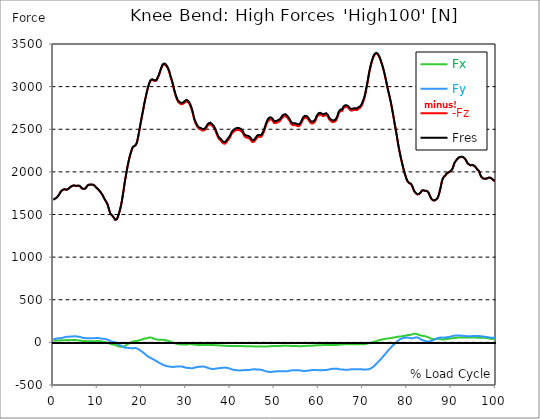
| Category |  Fx |  Fy |  -Fz |  Fres |
|---|---|---|---|---|
| 0.0 | 21.043 | 37.534 | 1674.356 | 1675.414 |
| 0.167348456675344 | 20.883 | 38.448 | 1678.892 | 1679.949 |
| 0.334696913350688 | 20.722 | 39.361 | 1683.411 | 1684.469 |
| 0.5020453700260321 | 20.995 | 41.493 | 1687.754 | 1688.828 |
| 0.669393826701376 | 21.46 | 43.768 | 1693.54 | 1694.63 |
| 0.83674228337672 | 22.02 | 45.387 | 1703.412 | 1704.502 |
| 1.0040907400520642 | 22.694 | 47.182 | 1712.596 | 1713.701 |
| 1.1621420602454444 | 22.886 | 47.871 | 1722.147 | 1723.237 |
| 1.3294905169207885 | 22.053 | 46.99 | 1736.283 | 1737.34 |
| 1.4968389735961325 | 22.613 | 47.423 | 1753.191 | 1754.248 |
| 1.6641874302714765 | 23.719 | 49.009 | 1767.262 | 1768.336 |
| 1.8315358869468206 | 23.896 | 50.884 | 1777.759 | 1778.849 |
| 1.9988843436221646 | 24.232 | 53.224 | 1784.987 | 1786.109 |
| 2.1662328002975086 | 24.473 | 55.452 | 1790.1 | 1791.286 |
| 2.333581256972853 | 24.905 | 57.679 | 1793.53 | 1794.764 |
| 2.5009297136481967 | 25.723 | 59.987 | 1794.94 | 1796.254 |
| 2.6682781703235405 | 26.155 | 62.103 | 1794.315 | 1795.709 |
| 2.8356266269988843 | 26.572 | 63.834 | 1789.843 | 1791.286 |
| 3.002975083674229 | 27.325 | 65.805 | 1789.651 | 1791.142 |
| 3.1703235403495724 | 28.078 | 67.504 | 1792.632 | 1794.171 |
| 3.337671997024917 | 27.742 | 67.36 | 1797.152 | 1798.69 |
| 3.4957233172182973 | 26.588 | 66.654 | 1802.857 | 1804.347 |
| 3.663071773893641 | 25.835 | 67.055 | 1813.354 | 1814.861 |
| 3.8304202305689854 | 25.578 | 67.456 | 1822.073 | 1823.595 |
| 3.997768687244329 | 26.091 | 68.225 | 1827.201 | 1828.74 |
| 4.165117143919673 | 26.973 | 68.962 | 1831.993 | 1833.564 |
| 4.332465600595017 | 27.502 | 69.699 | 1835.679 | 1837.282 |
| 4.499814057270361 | 27.678 | 70.517 | 1838.5 | 1840.135 |
| 4.667162513945706 | 27.694 | 71.126 | 1840.487 | 1842.154 |
| 4.834510970621049 | 27.213 | 71.046 | 1839.013 | 1840.68 |
| 5.001859427296393 | 27.021 | 71.318 | 1834.974 | 1836.657 |
| 5.169207883971737 | 26.796 | 70.421 | 1833.532 | 1835.199 |
| 5.336556340647081 | 25.466 | 68.321 | 1834.718 | 1836.288 |
| 5.503904797322425 | 24.232 | 67.76 | 1837.09 | 1838.612 |
| 5.671253253997769 | 23.206 | 67.103 | 1838.356 | 1839.862 |
| 5.82930457419115 | 22.678 | 66.35 | 1836.705 | 1838.179 |
| 5.996653030866494 | 22.325 | 64.875 | 1832.057 | 1833.5 |
| 6.164001487541838 | 21.444 | 62.696 | 1825.07 | 1826.464 |
| 6.331349944217181 | 18.671 | 58.016 | 1811.832 | 1813.226 |
| 6.498698400892526 | 16.86 | 54.731 | 1802.344 | 1803.754 |
| 6.66604685756787 | 16.427 | 53.24 | 1800.181 | 1801.607 |
| 6.833395314243213 | 16.123 | 51.189 | 1798.85 | 1800.213 |
| 7.000743770918558 | 15.754 | 50.419 | 1799.507 | 1800.886 |
| 7.168092227593902 | 15.385 | 50.195 | 1802.585 | 1803.995 |
| 7.335440684269246 | 14.905 | 49.81 | 1809.428 | 1810.902 |
| 7.50278914094459 | 14.167 | 48.48 | 1820.166 | 1821.688 |
| 7.6701375976199335 | 13.462 | 48.112 | 1836.288 | 1837.843 |
| 7.837486054295278 | 13.046 | 48.625 | 1843.084 | 1844.654 |
| 7.995537374488658 | 12.998 | 48.336 | 1848.388 | 1849.927 |
| 8.162885831164003 | 12.965 | 48.368 | 1850.953 | 1852.491 |
| 8.330234287839346 | 13.51 | 48.288 | 1849.366 | 1850.905 |
| 8.49758274451469 | 13.863 | 47.951 | 1848.468 | 1849.991 |
| 8.664931201190035 | 13.719 | 47.503 | 1850.231 | 1851.754 |
| 8.832279657865378 | 13.558 | 47.535 | 1850.568 | 1852.074 |
| 8.999628114540721 | 13.558 | 48.256 | 1848.02 | 1849.558 |
| 9.166976571216066 | 13.703 | 48.929 | 1843.805 | 1845.359 |
| 9.334325027891412 | 13.735 | 49.73 | 1836.657 | 1838.26 |
| 9.501673484566755 | 13.911 | 50.612 | 1827.313 | 1828.948 |
| 9.669021941242098 | 14.584 | 50.948 | 1816.992 | 1818.659 |
| 9.836370397917442 | 15.065 | 50.964 | 1807.873 | 1809.54 |
| 10.003718854592787 | 14.985 | 51.125 | 1800.822 | 1802.488 |
| 10.17106731126813 | 14.937 | 50.788 | 1792.808 | 1794.459 |
| 10.329118631461512 | 14.472 | 49.618 | 1782.583 | 1784.218 |
| 10.496467088136853 | 13.254 | 46.862 | 1772.182 | 1773.737 |
| 10.663815544812199 | 12.276 | 45.612 | 1762.005 | 1763.48 |
| 10.831164001487544 | 10.417 | 44.281 | 1750.53 | 1751.989 |
| 10.998512458162887 | 8.975 | 43.512 | 1737.18 | 1738.607 |
| 11.16586091483823 | 8.366 | 44.153 | 1722.388 | 1723.83 |
| 11.333209371513574 | 6.763 | 43.208 | 1704.887 | 1706.265 |
| 11.50055782818892 | 4.215 | 41.332 | 1687.242 | 1688.556 |
| 11.667906284864264 | 3.798 | 41.252 | 1672.689 | 1673.956 |
| 11.835254741539607 | 1.186 | 37.534 | 1657.641 | 1658.762 |
| 12.00260319821495 | -1.282 | 33.688 | 1644.371 | 1645.364 |
| 12.169951654890292 | -2.821 | 32.309 | 1627.911 | 1628.857 |
| 12.337300111565641 | -4.519 | 31.3 | 1604.128 | 1605.057 |
| 12.504648568240984 | -7.164 | 27.678 | 1574.174 | 1575.024 |
| 12.662699888434362 | -11.187 | 22.597 | 1544.926 | 1545.679 |
| 12.830048345109708 | -15.225 | 17.453 | 1516.495 | 1517.184 |
| 12.997396801785053 | -19.2 | 11.796 | 1503.033 | 1503.738 |
| 13.164745258460396 | -22.101 | 7.597 | 1495.516 | 1496.285 |
| 13.33209371513574 | -23.96 | 6.587 | 1486.317 | 1487.086 |
| 13.499442171811083 | -25.675 | 5.737 | 1476.941 | 1477.695 |
| 13.666790628486426 | -26.364 | 6.074 | 1462.838 | 1463.559 |
| 13.834139085161771 | -28.095 | 3.975 | 1449.76 | 1450.482 |
| 14.001487541837117 | -30.37 | 0.641 | 1437.212 | 1437.949 |
| 14.16883599851246 | -33.159 | -3.558 | 1433.75 | 1434.535 |
| 14.336184455187803 | -37.646 | -10.065 | 1443.222 | 1444.103 |
| 14.503532911863147 | -42.583 | -17.677 | 1460.402 | 1461.444 |
| 14.670881368538492 | -45.916 | -23.671 | 1484.81 | 1485.996 |
| 14.828932688731873 | -48.641 | -29.377 | 1513.145 | 1514.459 |
| 14.996281145407215 | -50.035 | -32.598 | 1541.288 | 1542.698 |
| 15.163629602082558 | -50.211 | -36.557 | 1575.264 | 1576.723 |
| 15.330978058757903 | -50.035 | -40.868 | 1615.01 | 1616.549 |
| 15.498326515433247 | -49.65 | -44.858 | 1661.102 | 1662.705 |
| 15.665674972108594 | -48.544 | -48.608 | 1712.019 | 1713.685 |
| 15.833023428783937 | -48.881 | -54.074 | 1769.281 | 1771.092 |
| 16.00037188545928 | -47.374 | -59.907 | 1827.265 | 1829.157 |
| 16.167720342134626 | -42.534 | -62.151 | 1886.772 | 1888.599 |
| 16.335068798809967 | -37.534 | -63.465 | 1935.172 | 1936.903 |
| 16.502417255485312 | -30.995 | -62.712 | 1984.117 | 1985.736 |
| 16.669765712160658 | -25.354 | -62.712 | 2033.447 | 2035.001 |
| 16.837114168836 | -19.168 | -63.914 | 2079.01 | 2080.549 |
| 17.004462625511344 | -14.504 | -65.212 | 2118.9 | 2120.439 |
| 17.16251394570472 | -9.904 | -66.654 | 2158.454 | 2160.04 |
| 17.32986240238007 | -4.92 | -67.36 | 2192.847 | 2194.433 |
| 17.497210859055414 | -1.33 | -67.6 | 2221.39 | 2222.977 |
| 17.664559315730756 | 2.244 | -67.824 | 2249.324 | 2250.911 |
| 17.8319077724061 | 5.898 | -67.888 | 2274.294 | 2275.848 |
| 17.999256229081443 | 9.552 | -68.177 | 2293.333 | 2294.904 |
| 18.166604685756788 | 12.549 | -68.289 | 2304.279 | 2305.85 |
| 18.333953142432133 | 13.847 | -67.087 | 2302.34 | 2303.895 |
| 18.501301599107478 | 14.937 | -66.27 | 2302.901 | 2304.423 |
| 18.668650055782823 | 15.754 | -67.392 | 2316.379 | 2317.95 |
| 18.835998512458165 | 16.395 | -69.844 | 2337.037 | 2338.704 |
| 19.00334696913351 | 18.238 | -73.434 | 2368.658 | 2370.437 |
| 19.170695425808855 | 20.53 | -78.354 | 2408.452 | 2410.391 |
| 19.338043882484197 | 22.822 | -83.723 | 2454.624 | 2456.724 |
| 19.496095202677576 | 25.098 | -89.156 | 2503.008 | 2505.252 |
| 19.66344365935292 | 27.341 | -94.925 | 2551.12 | 2553.54 |
| 19.830792116028263 | 29.938 | -101.416 | 2598.767 | 2601.443 |
| 19.998140572703612 | 33.079 | -107.394 | 2645.26 | 2648.209 |
| 20.165489029378953 | 36.092 | -113.58 | 2689.044 | 2692.266 |
| 20.3328374860543 | 39.65 | -120.119 | 2733.598 | 2737.108 |
| 20.500185942729644 | 42.55 | -127.523 | 2781.004 | 2784.851 |
| 20.667534399404985 | 44.81 | -134.495 | 2824.693 | 2828.844 |
| 20.83488285608033 | 45.708 | -142.588 | 2863.413 | 2867.997 |
| 21.002231312755672 | 46.509 | -150.233 | 2900.755 | 2905.707 |
| 21.16957976943102 | 48.865 | -157.365 | 2939.924 | 2945.244 |
| 21.336928226106362 | 51.894 | -163.246 | 2974.942 | 2980.599 |
| 21.504276682781704 | 53.961 | -168.856 | 3005.568 | 3011.498 |
| 21.67162513945705 | 55.612 | -173.888 | 3032.861 | 3039.048 |
| 21.82967645965043 | 56.702 | -178.231 | 3054.465 | 3060.892 |
| 21.997024916325774 | 57.07 | -182.43 | 3070.604 | 3077.239 |
| 22.16437337300112 | 56.285 | -187.238 | 3079.306 | 3086.182 |
| 22.33172182967646 | 53.609 | -192.495 | 3079.675 | 3086.791 |
| 22.499070286351806 | 49.746 | -198.104 | 3078.441 | 3085.781 |
| 22.666418743027148 | 45.211 | -202.191 | 3069.835 | 3077.399 |
| 22.833767199702496 | 41.348 | -205.925 | 3064.626 | 3072.415 |
| 23.00111565637784 | 38.335 | -209.884 | 3065.251 | 3073.264 |
| 23.168464113053183 | 35.659 | -214.627 | 3065.86 | 3074.178 |
| 23.335812569728528 | 33.896 | -220.733 | 3072.367 | 3081.101 |
| 23.50316102640387 | 33.031 | -225.413 | 3091.198 | 3100.205 |
| 23.670509483079215 | 32.101 | -231.648 | 3108.955 | 3118.363 |
| 23.83785793975456 | 30.563 | -237.754 | 3126.841 | 3136.649 |
| 23.995909259947936 | 30.771 | -242.93 | 3152.275 | 3162.404 |
| 24.163257716623285 | 31.508 | -246.825 | 3178.975 | 3189.329 |
| 24.330606173298627 | 31.316 | -250.655 | 3205.403 | 3215.981 |
| 24.49795462997397 | 31.684 | -254.63 | 3227.103 | 3237.953 |
| 24.665303086649313 | 31.797 | -258.78 | 3246.447 | 3257.586 |
| 24.83265154332466 | 30.771 | -263.396 | 3256.768 | 3268.259 |
| 25.0 | 29.313 | -267.451 | 3259.861 | 3271.625 |
| 25.167348456675345 | 27.79 | -270.736 | 3260.23 | 3272.25 |
| 25.334696913350694 | 26.059 | -273.589 | 3254.541 | 3266.785 |
| 25.502045370026035 | 24.104 | -276.394 | 3244.828 | 3257.329 |
| 25.669393826701377 | 21.94 | -279.054 | 3231.046 | 3243.755 |
| 25.836742283376722 | 20.161 | -280.705 | 3214.763 | 3227.664 |
| 26.004090740052067 | 17.838 | -282.404 | 3196.46 | 3209.57 |
| 26.17143919672741 | 15.161 | -284.118 | 3172.661 | 3185.979 |
| 26.329490516920792 | 12.677 | -284.295 | 3143.957 | 3157.372 |
| 26.49683897359613 | 8.606 | -283.926 | 3109.068 | 3122.482 |
| 26.66418743027148 | 3.862 | -286.346 | 3085.525 | 3099.195 |
| 26.831535886946828 | -0.16 | -288.846 | 3056.837 | 3070.828 |
| 26.998884343622166 | -3.013 | -289.952 | 3023.085 | 3037.301 |
| 27.166232800297514 | -5.112 | -288.029 | 2987.699 | 3001.962 |
| 27.333581256972852 | -7.853 | -286.394 | 2948.61 | 2962.97 |
| 27.5009297136482 | -10.001 | -285.513 | 2918.432 | 2932.888 |
| 27.668278170323543 | -12.645 | -285.224 | 2889.087 | 2903.688 |
| 27.835626626998888 | -15.241 | -283.958 | 2863.525 | 2878.157 |
| 28.002975083674233 | -17.469 | -283.045 | 2841.873 | 2856.538 |
| 28.170323540349575 | -19.408 | -282.452 | 2825.045 | 2839.774 |
| 28.33767199702492 | -21.331 | -282.099 | 2815.189 | 2829.966 |
| 28.50502045370026 | -22.405 | -281.154 | 2806.294 | 2821.055 |
| 28.663071773893645 | -22.998 | -281.458 | 2799.563 | 2814.436 |
| 28.830420230568986 | -23.559 | -282.163 | 2794.707 | 2809.708 |
| 28.99776868724433 | -23.799 | -282.612 | 2791.213 | 2806.294 |
| 29.165117143919673 | -23.479 | -284.118 | 2794.435 | 2809.692 |
| 29.33246560059502 | -23.847 | -287.628 | 2802.16 | 2817.769 |
| 29.499814057270367 | -23.735 | -289.872 | 2804.596 | 2820.414 |
| 29.66716251394571 | -24.12 | -292.1 | 2813.042 | 2829.036 |
| 29.834510970621054 | -24.12 | -294.391 | 2820.093 | 2836.28 |
| 30.00185942729639 | -23.992 | -296.731 | 2826.392 | 2842.787 |
| 30.169207883971744 | -23.639 | -298.59 | 2827.898 | 2844.47 |
| 30.33655634064708 | -23.335 | -300.097 | 2823.106 | 2839.886 |
| 30.50390479732243 | -21.988 | -300.626 | 2813.586 | 2830.51 |
| 30.671253253997772 | -20.514 | -300.706 | 2803.618 | 2820.638 |
| 30.829304574191156 | -19.584 | -301.571 | 2790.075 | 2807.288 |
| 30.996653030866494 | -19.873 | -302.389 | 2771.004 | 2788.441 |
| 31.164001487541842 | -20.963 | -303.046 | 2746.692 | 2764.337 |
| 31.331349944217187 | -22.02 | -302.517 | 2719.879 | 2737.605 |
| 31.498698400892525 | -23.399 | -302.228 | 2688.628 | 2706.481 |
| 31.666046857567874 | -25.146 | -301.187 | 2650.597 | 2668.546 |
| 31.833395314243212 | -26.748 | -297.709 | 2613.703 | 2631.509 |
| 32.00074377091856 | -27.486 | -295.786 | 2589.087 | 2606.812 |
| 32.1680922275939 | -27.726 | -292.709 | 2567.595 | 2585.096 |
| 32.33544068426925 | -28.447 | -289.952 | 2550.19 | 2567.467 |
| 32.50278914094459 | -29.152 | -288.702 | 2532.305 | 2549.581 |
| 32.670137597619934 | -29.938 | -287.901 | 2518.842 | 2536.119 |
| 32.83748605429528 | -30.547 | -287.356 | 2510.108 | 2527.385 |
| 33.004834510970625 | -31.22 | -287.099 | 2503.104 | 2520.381 |
| 33.162885831164004 | -31.556 | -286.554 | 2500.268 | 2517.512 |
| 33.33023428783935 | -31.396 | -285.481 | 2497.655 | 2514.788 |
| 33.497582744514695 | -30.899 | -284.022 | 2491.437 | 2508.457 |
| 33.664931201190036 | -30.322 | -282.692 | 2484.129 | 2501.053 |
| 33.83227965786538 | -30.002 | -282.74 | 2483.376 | 2500.3 |
| 33.99962811454073 | -30.29 | -283.493 | 2486.902 | 2503.89 |
| 34.16697657121607 | -30.547 | -285.785 | 2489.738 | 2506.999 |
| 34.33432502789141 | -30.579 | -288.446 | 2495.62 | 2513.169 |
| 34.50167348456676 | -30.29 | -290.689 | 2505.941 | 2523.698 |
| 34.6690219412421 | -30.482 | -293.83 | 2522.224 | 2540.238 |
| 34.83637039791744 | -30.563 | -298.158 | 2538.507 | 2556.905 |
| 35.00371885459279 | -30.627 | -300.658 | 2548.347 | 2566.986 |
| 35.17106731126814 | -30.867 | -304.055 | 2552.963 | 2571.986 |
| 35.338415767943474 | -30.899 | -306.956 | 2557.13 | 2576.49 |
| 35.49646708813686 | -30.947 | -308.254 | 2557.819 | 2577.323 |
| 35.6638155448122 | -31.14 | -309.232 | 2553.267 | 2572.964 |
| 35.831164001487544 | -31.829 | -310.722 | 2543.555 | 2563.556 |
| 35.998512458162885 | -32.005 | -311.684 | 2535.654 | 2555.848 |
| 36.165860914838234 | -32.021 | -312.053 | 2526.76 | 2547.065 |
| 36.333209371513576 | -32.021 | -311.235 | 2512.656 | 2532.978 |
| 36.50055782818892 | -32.181 | -310.033 | 2496.533 | 2516.823 |
| 36.667906284864266 | -32.518 | -308.11 | 2477.558 | 2497.752 |
| 36.83525474153961 | -33.239 | -307.197 | 2455.602 | 2475.859 |
| 37.002603198214956 | -34.04 | -306.892 | 2433.437 | 2453.855 |
| 37.1699516548903 | -34.169 | -305.418 | 2411.641 | 2432.075 |
| 37.337300111565646 | -34.489 | -302.869 | 2395.134 | 2415.359 |
| 37.50464856824098 | -35.675 | -301.635 | 2381.527 | 2401.753 |
| 37.66269988843437 | -36.156 | -301.219 | 2373.754 | 2393.996 |
| 37.83004834510971 | -36.637 | -300.642 | 2368.177 | 2388.37 |
| 37.99739680178505 | -37.31 | -300.033 | 2357.952 | 2378.178 |
| 38.16474525846039 | -37.582 | -298.542 | 2344.65 | 2364.811 |
| 38.33209371513574 | -38.271 | -297.244 | 2336.204 | 2356.285 |
| 38.49944217181109 | -39.057 | -296.315 | 2331.669 | 2351.702 |
| 38.666790628486424 | -39.57 | -296.058 | 2330.434 | 2350.452 |
| 38.83413908516178 | -40.114 | -295.946 | 2331.076 | 2351.077 |
| 39.001487541837115 | -40.355 | -296.523 | 2339.025 | 2359.042 |
| 39.16883599851246 | -40.884 | -297.757 | 2350.035 | 2370.148 |
| 39.336184455187805 | -41.14 | -299.376 | 2362.151 | 2382.393 |
| 39.503532911863154 | -41.509 | -301.171 | 2373.546 | 2393.948 |
| 39.670881368538495 | -41.99 | -303.783 | 2383.002 | 2403.644 |
| 39.83822982521384 | -41.909 | -306.427 | 2394.573 | 2415.471 |
| 39.996281145407224 | -41.765 | -308.286 | 2410.808 | 2431.786 |
| 40.163629602082565 | -42.278 | -311.668 | 2428.741 | 2450.008 |
| 40.33097805875791 | -42.55 | -316.973 | 2448.374 | 2470.154 |
| 40.498326515433256 | -42.518 | -319.281 | 2459.16 | 2481.116 |
| 40.6656749721086 | -42.534 | -321.156 | 2468.038 | 2490.155 |
| 40.83302342878393 | -42.502 | -322.742 | 2473.888 | 2496.133 |
| 41.00037188545929 | -42.214 | -323.752 | 2479.161 | 2501.47 |
| 41.16772034213463 | -42.342 | -325.483 | 2484.081 | 2506.582 |
| 41.33506879880997 | -42.438 | -326.605 | 2490.508 | 2513.073 |
| 41.50241725548531 | -42.679 | -326.781 | 2493.681 | 2516.23 |
| 41.66976571216066 | -43.272 | -327.935 | 2492.254 | 2514.964 |
| 41.837114168836 | -43.496 | -328.48 | 2491.549 | 2514.355 |
| 42.004462625511344 | -43.592 | -328.848 | 2490.459 | 2513.313 |
| 42.17181108218669 | -43.72 | -329.249 | 2487.559 | 2510.493 |
| 42.32986240238007 | -43.576 | -328.768 | 2481.725 | 2504.643 |
| 42.497210859055414 | -43.432 | -328.288 | 2475.875 | 2498.777 |
| 42.66455931573076 | -43.512 | -327.807 | 2468.343 | 2491.261 |
| 42.831907772406105 | -43.945 | -327.31 | 2455.986 | 2478.936 |
| 42.999256229081446 | -44.554 | -325.852 | 2436.354 | 2459.32 |
| 43.16660468575679 | -45.083 | -325.643 | 2419.975 | 2443.101 |
| 43.33395314243214 | -45.403 | -325.243 | 2409.894 | 2433.084 |
| 43.50130159910748 | -45.515 | -324.842 | 2403.564 | 2426.77 |
| 43.66865005578282 | -45.74 | -325.162 | 2401.095 | 2424.382 |
| 43.83599851245817 | -45.788 | -325.002 | 2400.631 | 2423.885 |
| 44.00334696913351 | -45.836 | -324.826 | 2400.182 | 2423.42 |
| 44.17069542580886 | -45.884 | -323.928 | 2396.897 | 2420.039 |
| 44.3380438824842 | -45.932 | -322.903 | 2391.976 | 2415.007 |
| 44.49609520267758 | -46.188 | -322.486 | 2383.242 | 2406.288 |
| 44.66344365935292 | -45.932 | -320.402 | 2369.09 | 2391.992 |
| 44.83079211602827 | -45.98 | -318.672 | 2358.737 | 2381.495 |
| 44.99814057270361 | -46.124 | -317.037 | 2349.474 | 2372.103 |
| 45.16548902937895 | -46.493 | -316.348 | 2348.352 | 2370.918 |
| 45.332837486054295 | -46.797 | -315.899 | 2353.368 | 2375.822 |
| 45.500185942729644 | -47.07 | -315.803 | 2361.414 | 2383.771 |
| 45.66753439940499 | -47.406 | -316.524 | 2371.158 | 2393.515 |
| 45.83488285608033 | -47.471 | -316.508 | 2383.931 | 2406.144 |
| 46.00223131275568 | -47.278 | -317.79 | 2399.236 | 2421.449 |
| 46.16957976943102 | -47.214 | -317.838 | 2405.984 | 2428.116 |
| 46.336928226106366 | -47.118 | -318.591 | 2411.352 | 2433.517 |
| 46.50427668278171 | -46.846 | -320.098 | 2413.292 | 2435.649 |
| 46.671625139457056 | -46.653 | -319.745 | 2409.894 | 2432.219 |
| 46.829676459650436 | -46.637 | -319.281 | 2406.304 | 2428.597 |
| 46.99702491632577 | -47.198 | -321.284 | 2411.256 | 2433.806 |
| 47.16437337300112 | -47.823 | -323.175 | 2422.315 | 2445.024 |
| 47.33172182967646 | -48.128 | -325.852 | 2438.085 | 2461.003 |
| 47.49907028635181 | -48.32 | -328.977 | 2456.531 | 2479.706 |
| 47.66641874302716 | -48.4 | -332.663 | 2479.145 | 2502.608 |
| 47.83376719970249 | -48.32 | -335.772 | 2503.233 | 2526.856 |
| 48.001115656377834 | -48.416 | -337.936 | 2532.209 | 2555.848 |
| 48.16846411305319 | -48.368 | -340.291 | 2558.284 | 2581.971 |
| 48.33581256972853 | -47.727 | -342.711 | 2576.81 | 2600.626 |
| 48.50316102640387 | -47.246 | -344.619 | 2593.398 | 2617.309 |
| 48.67050948307921 | -46.381 | -345.821 | 2605.097 | 2629.057 |
| 48.837857939754564 | -45.435 | -346.382 | 2611.941 | 2635.884 |
| 49.005206396429905 | -44.778 | -346.718 | 2615.867 | 2639.811 |
| 49.163257716623285 | -44.057 | -346.414 | 2615.178 | 2639.09 |
| 49.33060617329863 | -43.368 | -346.365 | 2611.668 | 2635.596 |
| 49.49795462997397 | -43.111 | -345.917 | 2606.043 | 2629.938 |
| 49.66530308664932 | -42.951 | -344.779 | 2591.972 | 2615.835 |
| 49.832651543324666 | -43.111 | -342.231 | 2574.503 | 2598.19 |
| 50.0 | -42.695 | -341.91 | 2570.207 | 2593.879 |
| 50.16734845667534 | -42.246 | -341.157 | 2571.73 | 2595.289 |
| 50.33469691335069 | -41.621 | -340.612 | 2572.66 | 2596.122 |
| 50.50204537002604 | -41.685 | -339.618 | 2576.025 | 2599.328 |
| 50.66939382670139 | -42.214 | -338.961 | 2580.497 | 2603.655 |
| 50.836742283376715 | -42.342 | -338.352 | 2585.353 | 2608.351 |
| 51.00409074005207 | -42.422 | -338.416 | 2588.141 | 2611.107 |
| 51.17143919672741 | -41.973 | -338.432 | 2593.157 | 2616.059 |
| 51.32949051692079 | -41.573 | -338.208 | 2603.559 | 2626.332 |
| 51.496838973596134 | -41.172 | -338.4 | 2615.931 | 2638.625 |
| 51.66418743027148 | -40.804 | -338.769 | 2629.249 | 2651.895 |
| 51.831535886946824 | -40.868 | -339.426 | 2641.429 | 2664.059 |
| 51.99888434362217 | -40.82 | -339.618 | 2647.167 | 2669.78 |
| 52.16623280029752 | -40.723 | -340.019 | 2651.638 | 2674.284 |
| 52.33358125697285 | -40.211 | -339.987 | 2653.545 | 2676.191 |
| 52.5009297136482 | -39.938 | -339.714 | 2652.247 | 2674.893 |
| 52.668278170323546 | -39.938 | -339.282 | 2648.77 | 2671.415 |
| 52.835626626998895 | -39.938 | -338.753 | 2639.106 | 2661.751 |
| 53.00297508367424 | -40.179 | -337.262 | 2628.288 | 2650.821 |
| 53.17032354034958 | -40.467 | -335.467 | 2617.085 | 2639.49 |
| 53.33767199702492 | -40.948 | -334.009 | 2603.847 | 2626.188 |
| 53.50502045370027 | -41.252 | -332.535 | 2590.481 | 2612.758 |
| 53.663071773893655 | -41.525 | -329.97 | 2571.762 | 2593.879 |
| 53.83042023056899 | -41.829 | -328.127 | 2558.572 | 2580.577 |
| 53.99776868724433 | -42.358 | -327.182 | 2551.376 | 2573.349 |
| 54.16511714391967 | -43.063 | -326.861 | 2547.29 | 2569.294 |
| 54.33246560059503 | -43.48 | -327.102 | 2546.552 | 2568.621 |
| 54.49981405727037 | -43.56 | -326.733 | 2548.972 | 2570.961 |
| 54.667162513945705 | -43.512 | -326.364 | 2551.28 | 2573.172 |
| 54.834510970621054 | -43.464 | -326.172 | 2546.873 | 2568.765 |
| 55.0018594272964 | -43.672 | -326.252 | 2541.264 | 2563.252 |
| 55.169207883971744 | -43.945 | -326.22 | 2537.626 | 2559.662 |
| 55.336556340647086 | -44.249 | -326.124 | 2535.574 | 2557.611 |
| 55.50390479732243 | -44.634 | -327.342 | 2535.59 | 2557.819 |
| 55.671253253997776 | -44.618 | -328.4 | 2541.231 | 2563.556 |
| 55.83860171067312 | -44.666 | -329.217 | 2551.12 | 2573.477 |
| 55.9966530308665 | -44.361 | -330.772 | 2564.823 | 2587.276 |
| 56.16400148754184 | -44.153 | -333.288 | 2582.676 | 2605.29 |
| 56.33134994421718 | -43.608 | -334.971 | 2603.543 | 2626.204 |
| 56.498698400892536 | -42.967 | -335.692 | 2619.265 | 2641.878 |
| 56.66604685756788 | -42.214 | -335.852 | 2628.496 | 2651.029 |
| 56.83339531424321 | -41.717 | -335.035 | 2634.714 | 2657.071 |
| 57.00074377091856 | -41.22 | -334.442 | 2636.044 | 2658.305 |
| 57.16809222759391 | -40.804 | -334.025 | 2633.592 | 2655.821 |
| 57.33544068426925 | -40.082 | -333.256 | 2628.063 | 2650.212 |
| 57.5027891409446 | -39.089 | -332.166 | 2622.807 | 2644.843 |
| 57.670137597619934 | -38.368 | -330.964 | 2613.784 | 2635.74 |
| 57.83748605429528 | -38.287 | -330.243 | 2598.046 | 2620.018 |
| 58.004834510970625 | -38.255 | -328.384 | 2584.599 | 2606.443 |
| 58.16288583116401 | -38.448 | -326.669 | 2574.246 | 2595.946 |
| 58.330234287839346 | -38.656 | -325.771 | 2567.435 | 2589.071 |
| 58.497582744514695 | -38.432 | -324.698 | 2566.569 | 2588.077 |
| 58.66493120119004 | -38.079 | -323.656 | 2568.973 | 2590.321 |
| 58.832279657865385 | -37.614 | -323.944 | 2572.243 | 2593.574 |
| 58.999628114540734 | -37.133 | -323.976 | 2579.904 | 2601.171 |
| 59.16697657121607 | -36.236 | -324.008 | 2592.1 | 2613.239 |
| 59.33432502789142 | -35.547 | -323.864 | 2609.537 | 2630.515 |
| 59.50167348456676 | -34.505 | -324.201 | 2632.983 | 2653.834 |
| 59.66902194124211 | -34.281 | -324.569 | 2647.423 | 2668.194 |
| 59.83637039791745 | -34.345 | -325.98 | 2658.882 | 2679.733 |
| 60.00371885459278 | -34.265 | -327.278 | 2668.13 | 2689.076 |
| 60.17106731126813 | -33.96 | -327.951 | 2672.505 | 2693.5 |
| 60.33841576794349 | -33.463 | -327.999 | 2671.944 | 2692.955 |
| 60.49646708813685 | -32.999 | -327.695 | 2669.716 | 2690.727 |
| 60.6638155448122 | -32.326 | -327.102 | 2662.937 | 2683.916 |
| 60.831164001487544 | -32.277 | -326.172 | 2655.837 | 2676.752 |
| 60.99851245816289 | -32.117 | -325.323 | 2653.113 | 2673.947 |
| 61.16586091483824 | -31.973 | -324.682 | 2653.914 | 2674.668 |
| 61.333209371513576 | -32.037 | -324.505 | 2660.453 | 2681.159 |
| 61.50055782818892 | -31.973 | -324.265 | 2666.463 | 2687.121 |
| 61.667906284864266 | -31.556 | -323.8 | 2668.082 | 2688.676 |
| 61.835254741539615 | -31.492 | -322.999 | 2662.713 | 2683.259 |
| 62.002603198214956 | -31.604 | -321.604 | 2653.241 | 2673.691 |
| 62.16995165489029 | -31.861 | -319.729 | 2636.862 | 2657.216 |
| 62.33730011156564 | -32.117 | -317.454 | 2619.169 | 2639.394 |
| 62.504648568240995 | -32.133 | -315.45 | 2606.988 | 2627.07 |
| 62.67199702491633 | -31.733 | -313.367 | 2600.065 | 2619.954 |
| 62.83004834510971 | -31.172 | -311.46 | 2591.042 | 2610.755 |
| 62.99739680178505 | -30.915 | -309.857 | 2584.904 | 2604.456 |
| 63.1647452584604 | -30.739 | -308.96 | 2583.59 | 2603.014 |
| 63.33209371513575 | -30.675 | -308.815 | 2584.92 | 2604.296 |
| 63.4994421718111 | -30.707 | -308.944 | 2586.571 | 2605.931 |
| 63.666790628486424 | -30.659 | -308.783 | 2590.144 | 2609.44 |
| 63.83413908516177 | -30.402 | -308.335 | 2598.142 | 2617.309 |
| 64.00148754183712 | -29.986 | -308.543 | 2609.921 | 2629.025 |
| 64.16883599851248 | -29.136 | -309.024 | 2629.842 | 2648.882 |
| 64.3361844551878 | -28.095 | -310.29 | 2656.719 | 2675.726 |
| 64.50353291186315 | -26.893 | -313.11 | 2685.294 | 2704.43 |
| 64.6708813685385 | -26.492 | -315.146 | 2697.859 | 2717.155 |
| 64.83822982521384 | -26.107 | -316.845 | 2709.382 | 2728.806 |
| 65.00557828188919 | -25.723 | -317.934 | 2714.078 | 2733.598 |
| 65.16362960208257 | -25.29 | -317.966 | 2712.443 | 2731.979 |
| 65.3309780587579 | -24.841 | -317.678 | 2715.344 | 2734.832 |
| 65.49832651543326 | -24.2 | -318.575 | 2737.364 | 2756.82 |
| 65.6656749721086 | -23.255 | -319.585 | 2751.564 | 2771.068 |
| 65.83302342878395 | -23.046 | -320.402 | 2758.247 | 2777.847 |
| 66.00037188545929 | -22.822 | -320.803 | 2761.628 | 2781.293 |
| 66.16772034213463 | -22.645 | -321.556 | 2762.205 | 2781.966 |
| 66.33506879880998 | -22.293 | -321.989 | 2760.795 | 2780.636 |
| 66.50241725548531 | -21.78 | -322.149 | 2757.638 | 2777.527 |
| 66.66976571216065 | -21.411 | -321.54 | 2751.468 | 2771.324 |
| 66.83711416883601 | -21.604 | -319.826 | 2741.05 | 2760.811 |
| 67.00446262551135 | -21.892 | -318.015 | 2730.313 | 2749.945 |
| 67.1718110821867 | -22.277 | -316.492 | 2720.6 | 2740.137 |
| 67.32986240238007 | -22.694 | -316.22 | 2718.613 | 2738.166 |
| 67.49721085905541 | -22.854 | -316.572 | 2719.959 | 2739.576 |
| 67.66455931573076 | -22.71 | -316.7 | 2721.578 | 2741.195 |
| 67.83190777240611 | -22.581 | -316.716 | 2723.678 | 2743.262 |
| 67.99925622908145 | -22.469 | -316.508 | 2726.61 | 2746.147 |
| 68.16660468575678 | -22.613 | -316.572 | 2727.171 | 2746.708 |
| 68.33395314243214 | -22.694 | -315.723 | 2726.146 | 2745.602 |
| 68.50130159910749 | -22.437 | -314.809 | 2724.575 | 2743.935 |
| 68.66865005578282 | -22.197 | -314.425 | 2725.184 | 2744.48 |
| 68.83599851245816 | -22.629 | -314.457 | 2732.043 | 2751.291 |
| 69.00334696913352 | -22.485 | -314.569 | 2741.707 | 2760.875 |
| 69.17069542580886 | -22.213 | -314.665 | 2745.906 | 2765.058 |
| 69.3380438824842 | -21.972 | -314.521 | 2749.048 | 2768.167 |
| 69.50539233915956 | -22.069 | -314.12 | 2757.269 | 2776.325 |
| 69.66344365935292 | -22.085 | -314.986 | 2771.805 | 2790.893 |
| 69.83079211602826 | -22.004 | -316.973 | 2791.87 | 2811.07 |
| 69.99814057270362 | -21.94 | -318.976 | 2811.936 | 2831.248 |
| 70.16548902937896 | -21.331 | -319.649 | 2836.921 | 2856.121 |
| 70.33283748605429 | -20.498 | -319.713 | 2864.166 | 2883.158 |
| 70.50018594272964 | -19.681 | -320.515 | 2898.239 | 2917.054 |
| 70.667534399405 | -18.463 | -319.473 | 2943.337 | 2961.688 |
| 70.83488285608033 | -16.363 | -318.095 | 2987.458 | 3005.248 |
| 71.00223131275568 | -14.632 | -316.78 | 3033.038 | 3050.395 |
| 71.16957976943102 | -12.597 | -316.572 | 3081.614 | 3098.618 |
| 71.33692822610637 | -10.129 | -315.45 | 3134.101 | 3150.673 |
| 71.50427668278171 | -7.468 | -311.62 | 3178.863 | 3194.778 |
| 71.67162513945706 | -4.968 | -307.838 | 3218.208 | 3233.498 |
| 71.8389735961324 | -2.596 | -303.158 | 3254.06 | 3268.708 |
| 71.99702491632577 | -0.385 | -298.238 | 3286.081 | 3300.072 |
| 72.16437337300113 | 1.907 | -292.468 | 3315.858 | 3329.16 |
| 72.33172182967647 | 4.263 | -286.218 | 3340.218 | 3352.847 |
| 72.49907028635181 | 6.587 | -279.086 | 3359.867 | 3371.775 |
| 72.66641874302715 | 8.895 | -270.384 | 3373.97 | 3385.093 |
| 72.8337671997025 | 11.587 | -261.729 | 3383.602 | 3394.003 |
| 73.00111565637783 | 14.344 | -252.514 | 3386.567 | 3396.263 |
| 73.16846411305319 | 17.309 | -243.571 | 3384.997 | 3394.068 |
| 73.33581256972853 | 20.209 | -234.42 | 3378.554 | 3386.984 |
| 73.50316102640387 | 22.421 | -225.141 | 3367.48 | 3375.316 |
| 73.67050948307921 | 25.21 | -216.07 | 3350.139 | 3357.447 |
| 73.83785793975457 | 27.357 | -206.774 | 3331.195 | 3337.959 |
| 74.00520639642991 | 30.258 | -198.28 | 3305.954 | 3312.332 |
| 74.16325771662328 | 32.694 | -189.354 | 3279.414 | 3285.344 |
| 74.33060617329863 | 34.778 | -178.648 | 3253.851 | 3259.316 |
| 74.49795462997398 | 36.765 | -169.769 | 3224.635 | 3229.715 |
| 74.66530308664932 | 38.239 | -159.143 | 3193.255 | 3197.951 |
| 74.83265154332466 | 39.586 | -149.063 | 3158.349 | 3162.628 |
| 75.00000000000001 | 40.98 | -138.581 | 3121.072 | 3124.886 |
| 75.16734845667534 | 42.791 | -127.603 | 3081.79 | 3085.172 |
| 75.3346969133507 | 44.073 | -117.234 | 3039.929 | 3042.958 |
| 75.50204537002605 | 44.858 | -107.057 | 2999.045 | 3001.722 |
| 75.66939382670138 | 45.692 | -96.72 | 2959.764 | 2962.233 |
| 75.83674228337672 | 46.301 | -87.2 | 2923.064 | 2925.355 |
| 76.00409074005208 | 47.471 | -78.37 | 2886.443 | 2888.591 |
| 76.17143919672742 | 48.689 | -69.475 | 2849.149 | 2851.153 |
| 76.33878765340276 | 50.195 | -60.196 | 2807.528 | 2809.404 |
| 76.49683897359614 | 51.798 | -50.516 | 2763.103 | 2764.802 |
| 76.66418743027148 | 53.545 | -40.643 | 2715.424 | 2716.93 |
| 76.83153588694682 | 55.772 | -32.806 | 2667.953 | 2669.38 |
| 76.99888434362218 | 57.808 | -24.825 | 2617.566 | 2618.912 |
| 77.16623280029752 | 59.795 | -14.712 | 2563.797 | 2565.015 |
| 77.33358125697285 | 61.253 | -7.036 | 2518.522 | 2519.756 |
| 77.5009297136482 | 62.311 | 0 | 2469.449 | 2470.715 |
| 77.66827817032356 | 63.337 | 7.004 | 2420.071 | 2421.385 |
| 77.83562662699889 | 64.875 | 15.498 | 2363.577 | 2364.892 |
| 78.00297508367423 | 66.622 | 22.982 | 2311.892 | 2313.318 |
| 78.17032354034959 | 68.818 | 29.393 | 2265.014 | 2266.585 |
| 78.33767199702493 | 69.892 | 35.451 | 2222.912 | 2224.611 |
| 78.50502045370027 | 70.581 | 39.153 | 2181.227 | 2183.054 |
| 78.67236891037561 | 70.501 | 42.999 | 2140.905 | 2142.844 |
| 78.83042023056899 | 71.51 | 45.804 | 2103.98 | 2106.015 |
| 78.99776868724433 | 73.129 | 48.897 | 2067.471 | 2069.635 |
| 79.16511714391969 | 74.764 | 51.862 | 2032.549 | 2034.841 |
| 79.33246560059503 | 76.398 | 54.57 | 2000.672 | 2003.076 |
| 79.49981405727036 | 77.04 | 54.827 | 1972.113 | 1974.549 |
| 79.66716251394571 | 78.626 | 55.292 | 1943.73 | 1946.278 |
| 79.83451097062107 | 82.008 | 56.205 | 1916.95 | 1919.69 |
| 80.00185942729641 | 84.668 | 56.189 | 1896.5 | 1899.369 |
| 80.16920788397174 | 86.271 | 55.548 | 1881.515 | 1884.464 |
| 80.33655634064709 | 87.024 | 54.586 | 1870.986 | 1873.951 |
| 80.50390479732243 | 87.248 | 53.224 | 1865.008 | 1867.957 |
| 80.67125325399778 | 87.649 | 50.211 | 1863.373 | 1866.274 |
| 80.83860171067312 | 89.075 | 48.208 | 1859.046 | 1861.995 |
| 80.99665303086651 | 92.794 | 48.32 | 1848.308 | 1851.498 |
| 81.16400148754184 | 96.063 | 48.769 | 1829.397 | 1832.811 |
| 81.3313499442172 | 98.9 | 49.169 | 1806.062 | 1809.684 |
| 81.49869840089255 | 101.111 | 51.83 | 1781.59 | 1785.484 |
| 81.66604685756786 | 101.56 | 54.009 | 1766.509 | 1770.531 |
| 81.83339531424322 | 101.127 | 57.038 | 1755.627 | 1759.746 |
| 82.00074377091858 | 101.015 | 58.962 | 1746.155 | 1750.37 |
| 82.16809222759392 | 98.227 | 58.994 | 1739.68 | 1743.735 |
| 82.33544068426926 | 93.707 | 57.84 | 1734.376 | 1738.142 |
| 82.50278914094459 | 89.733 | 54.811 | 1735.481 | 1738.975 |
| 82.67013759761994 | 86.688 | 48.961 | 1738.831 | 1742.116 |
| 82.83748605429528 | 84.011 | 42.39 | 1743.927 | 1747.069 |
| 83.00483451097062 | 82.601 | 37.005 | 1753.383 | 1756.508 |
| 83.17218296764597 | 80.469 | 33.271 | 1765.868 | 1768.913 |
| 83.33023428783935 | 78.017 | 29.473 | 1778.048 | 1780.981 |
| 83.4975827445147 | 76.158 | 26.235 | 1781.878 | 1784.747 |
| 83.66493120119004 | 74.988 | 23.303 | 1783.08 | 1785.837 |
| 83.83227965786537 | 73.898 | 20.578 | 1779.154 | 1781.942 |
| 83.99962811454073 | 72.664 | 17.741 | 1774.907 | 1777.695 |
| 84.16697657121607 | 70.196 | 14.504 | 1774.057 | 1776.75 |
| 84.33432502789142 | 67.488 | 13.27 | 1775.724 | 1778.288 |
| 84.50167348456677 | 64.571 | 12.324 | 1775.179 | 1777.599 |
| 84.6690219412421 | 61.061 | 10.754 | 1767.182 | 1769.426 |
| 84.83637039791745 | 58.272 | 9.824 | 1754.072 | 1756.22 |
| 85.0037188545928 | 54.554 | 10.818 | 1735.77 | 1737.773 |
| 85.17106731126813 | 49.859 | 13.478 | 1716.298 | 1718.125 |
| 85.33841576794349 | 45.948 | 16.716 | 1695.511 | 1697.306 |
| 85.50576422461883 | 43.784 | 19.921 | 1681.36 | 1683.155 |
| 85.66381554481221 | 41.348 | 22.389 | 1671.071 | 1672.882 |
| 85.83116400148755 | 38.384 | 25.226 | 1666.615 | 1668.394 |
| 85.99851245816289 | 37.983 | 29.168 | 1664.628 | 1666.295 |
| 86.16586091483823 | 38.159 | 33.463 | 1663.827 | 1665.381 |
| 86.33320937151358 | 38.175 | 38.159 | 1668.587 | 1670.125 |
| 86.50055782818893 | 38.448 | 42.454 | 1673.523 | 1675.061 |
| 86.66790628486427 | 39.537 | 46.253 | 1676.953 | 1678.571 |
| 86.83525474153961 | 41.541 | 49.666 | 1688.556 | 1690.303 |
| 87.00260319821496 | 41.733 | 52.086 | 1706.89 | 1708.733 |
| 87.16995165489031 | 41.22 | 52.968 | 1733.799 | 1735.706 |
| 87.33730011156564 | 40.275 | 54.282 | 1766.172 | 1768.127 |
| 87.504648568241 | 39.041 | 55.019 | 1802.04 | 1804.011 |
| 87.67199702491634 | 37.166 | 56.397 | 1843.532 | 1845.472 |
| 87.83004834510972 | 35.114 | 56.846 | 1882.974 | 1884.833 |
| 87.99739680178506 | 33.992 | 55.804 | 1912.43 | 1914.225 |
| 88.1647452584604 | 33.64 | 55.035 | 1930.621 | 1932.399 |
| 88.33209371513574 | 34.697 | 55.147 | 1942.721 | 1944.532 |
| 88.49944217181108 | 37.55 | 56.157 | 1947.801 | 1949.692 |
| 88.66679062848644 | 39.377 | 58.497 | 1958.875 | 1960.895 |
| 88.83413908516178 | 39.409 | 59.763 | 1973.828 | 1975.895 |
| 89.00148754183712 | 38.576 | 59.042 | 1981.921 | 1983.925 |
| 89.16883599851246 | 39.57 | 59.699 | 1986.97 | 1988.957 |
| 89.33618445518782 | 41.108 | 60.949 | 1992.355 | 1994.342 |
| 89.50353291186315 | 43.352 | 63.016 | 1997.147 | 1999.198 |
| 89.6708813685385 | 45.403 | 64.988 | 2002.323 | 2004.439 |
| 89.83822982521386 | 46.894 | 66.494 | 2009.006 | 2011.154 |
| 90.00557828188919 | 47.999 | 70.148 | 2016.186 | 2018.286 |
| 90.16362960208257 | 48.4 | 72.809 | 2028.687 | 2030.77 |
| 90.3309780587579 | 49.65 | 75.966 | 2047.294 | 2049.425 |
| 90.49832651543326 | 50.035 | 76.703 | 2074.074 | 2076.206 |
| 90.66567497210859 | 50.436 | 78.081 | 2100.582 | 2102.745 |
| 90.83302342878395 | 51.525 | 80.165 | 2115.711 | 2117.939 |
| 91.00037188545929 | 53.016 | 80.517 | 2127.122 | 2129.382 |
| 91.16772034213463 | 54.218 | 80.597 | 2138.645 | 2140.937 |
| 91.33506879880998 | 55.211 | 80.678 | 2150.424 | 2152.716 |
| 91.50241725548533 | 55.885 | 80.87 | 2159.111 | 2161.403 |
| 91.66976571216065 | 56.51 | 81.062 | 2166.675 | 2168.983 |
| 91.83711416883601 | 57.135 | 80.854 | 2169.704 | 2172.028 |
| 92.00446262551137 | 57.183 | 80.02 | 2172.669 | 2174.961 |
| 92.1718110821867 | 57.215 | 79.171 | 2175.586 | 2177.83 |
| 92.33915953886203 | 57.375 | 78.097 | 2176.323 | 2178.551 |
| 92.49721085905541 | 56.878 | 77.504 | 2174.865 | 2177.061 |
| 92.66455931573077 | 56.894 | 76.671 | 2170.65 | 2172.83 |
| 92.83190777240611 | 56.958 | 75.773 | 2164.64 | 2166.788 |
| 92.99925622908145 | 56.782 | 74.924 | 2156.771 | 2158.886 |
| 93.1666046857568 | 57.279 | 74.78 | 2145.921 | 2148.069 |
| 93.33395314243214 | 57.231 | 73.017 | 2132.907 | 2135.023 |
| 93.50130159910749 | 57.327 | 73.129 | 2112.57 | 2114.717 |
| 93.66865005578283 | 57.423 | 72.985 | 2098.563 | 2100.742 |
| 93.83599851245818 | 56.942 | 72.889 | 2090.838 | 2093.001 |
| 94.00334696913353 | 56.702 | 73.097 | 2085.309 | 2087.472 |
| 94.17069542580886 | 56.622 | 73.289 | 2080.132 | 2082.312 |
| 94.3380438824842 | 56.429 | 72.953 | 2075.805 | 2077.968 |
| 94.50539233915954 | 56.013 | 72.648 | 2075.917 | 2078.065 |
| 94.66344365935292 | 56.029 | 73.546 | 2078.545 | 2080.725 |
| 94.83079211602828 | 56.397 | 74.331 | 2077.872 | 2080.1 |
| 94.99814057270362 | 56.67 | 75.052 | 2074.891 | 2077.151 |
| 95.16548902937897 | 56.526 | 75.773 | 2070.66 | 2072.952 |
| 95.33283748605432 | 56.029 | 76.062 | 2062.599 | 2064.907 |
| 95.50018594272963 | 55.997 | 76.398 | 2052.967 | 2055.307 |
| 95.66753439940499 | 55.885 | 76.222 | 2041.636 | 2043.992 |
| 95.83488285608034 | 55.147 | 75.084 | 2026.491 | 2028.815 |
| 96.00223131275567 | 53.929 | 73.61 | 2020.946 | 2023.19 |
| 96.16957976943102 | 53.625 | 74.011 | 2013.061 | 2015.321 |
| 96.33692822610638 | 55.019 | 74.379 | 1994.374 | 1996.73 |
| 96.50427668278171 | 54.747 | 72.857 | 1968.619 | 1970.927 |
| 96.67162513945706 | 54.875 | 71.735 | 1949.051 | 1951.343 |
| 96.8389735961324 | 54.667 | 70.26 | 1935.733 | 1937.977 |
| 96.99702491632577 | 54.234 | 69.523 | 1928.152 | 1930.348 |
| 97.16437337300111 | 53.961 | 69.555 | 1922.319 | 1924.498 |
| 97.33172182967647 | 53.545 | 68.017 | 1918.232 | 1920.364 |
| 97.49907028635181 | 52.92 | 65.853 | 1916.597 | 1918.633 |
| 97.66641874302715 | 52.631 | 64.539 | 1918.665 | 1920.652 |
| 97.8337671997025 | 52.984 | 64.282 | 1919.963 | 1921.95 |
| 98.00111565637785 | 52.711 | 63.353 | 1917.639 | 1919.594 |
| 98.16846411305319 | 51.333 | 61.894 | 1924.018 | 1925.893 |
| 98.33581256972855 | 49.041 | 59.827 | 1930.108 | 1931.839 |
| 98.50316102640389 | 46.525 | 57.872 | 1932.303 | 1933.922 |
| 98.67050948307921 | 44.554 | 56.333 | 1931.63 | 1933.169 |
| 98.83785793975456 | 42.422 | 54.747 | 1929.579 | 1931.037 |
| 99.0052063964299 | 41.028 | 53.304 | 1925.38 | 1926.774 |
| 99.17255485310525 | 40.355 | 52.759 | 1918.601 | 1919.979 |
| 99.33060617329863 | 40.755 | 53.673 | 1907.911 | 1909.321 |
| 99.49795462997399 | 41.781 | 54.314 | 1900.282 | 1901.709 |
| 99.66530308664933 | 42.583 | 54.715 | 1895.282 | 1896.74 |
| 99.83265154332467 | 41.925 | 54.763 | 1894.16 | 1895.587 |
| 100.0 | 43.4 | 55.34 | 1889.32 | 1890.811 |